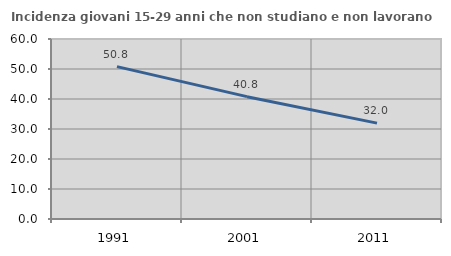
| Category | Incidenza giovani 15-29 anni che non studiano e non lavorano  |
|---|---|
| 1991.0 | 50.799 |
| 2001.0 | 40.78 |
| 2011.0 | 31.964 |